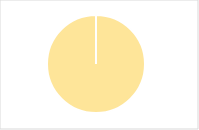
| Category | Total |
|---|---|
| Y | 0 |
| R | 0 |
| T | 0 |
| M | 0 |
| F | 0 |
| N | 71 |